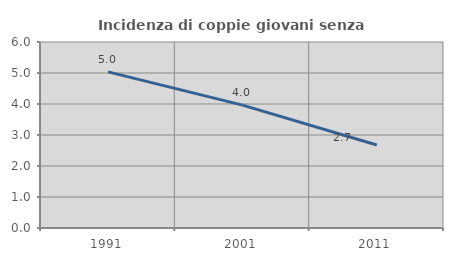
| Category | Incidenza di coppie giovani senza figli |
|---|---|
| 1991.0 | 5.035 |
| 2001.0 | 3.965 |
| 2011.0 | 2.679 |